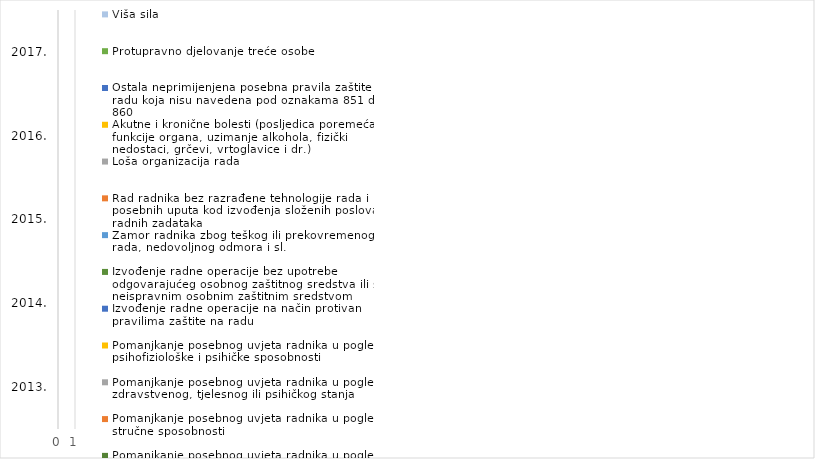
| Category | Pomanjkanje posebnog uvjeta radnika u pogledu dobi života | Pomanjkanje posebnog uvjeta radnika u pogledu stručne sposobnosti | Pomanjkanje posebnog uvjeta radnika u pogledu zdravstvenog, tjelesnog ili psihičkog stanja | Pomanjkanje posebnog uvjeta radnika u pogledu psihofiziološke i psihičke sposobnosti | Izvođenje radne operacije na način protivan pravilima zaštite na radu | Izvođenje radne operacije bez upotrebe odgovarajućeg osobnog zaštitnog sredstva ili s neispravnim osobnim zaštitnim sredstvom | Zamor radnika zbog teškog ili prekovremenog rada, nedovoljnog odmora i sl. | Rad radnika bez razrađene tehnologije rada i posebnih uputa kod izvođenja složenih poslova i radnih zadataka | Loša organizacija rada | Akutne i kronične bolesti (posljedica poremećaja funkcije organa, uzimanje alkohola, fizički nedostaci, grčevi, vrtoglavice i dr.) | Ostala neprimijenjena posebna pravila zaštite na radu koja nisu navedena pod oznakama 851 do 860 | Protupravno djelovanje treće osobe | Viša sila |
|---|---|---|---|---|---|---|---|---|---|---|---|---|---|
| 2013. | 0 | 0 | 0 | 0 | 0 | 0 | 0 | 0 | 0 | 0 | 0 | 0 | 0 |
| 2014. | 0 | 0 | 0 | 0 | 0 | 0 | 0 | 0 | 0 | 0 | 0 | 0 | 0 |
| 2015. | 0 | 0 | 0 | 0 | 0 | 0 | 0 | 0 | 0 | 0 | 0 | 0 | 0 |
| 2016. | 0 | 0 | 0 | 0 | 0 | 0 | 0 | 0 | 0 | 0 | 0 | 0 | 0 |
| 2017. | 0 | 0 | 0 | 0 | 0 | 0 | 0 | 0 | 0 | 0 | 0 | 0 | 0 |